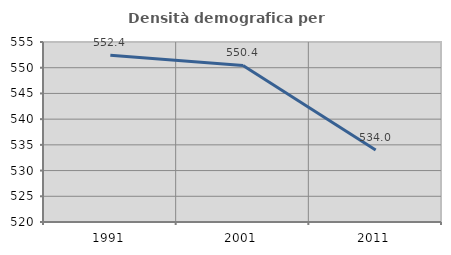
| Category | Densità demografica |
|---|---|
| 1991.0 | 552.423 |
| 2001.0 | 550.44 |
| 2011.0 | 533.998 |